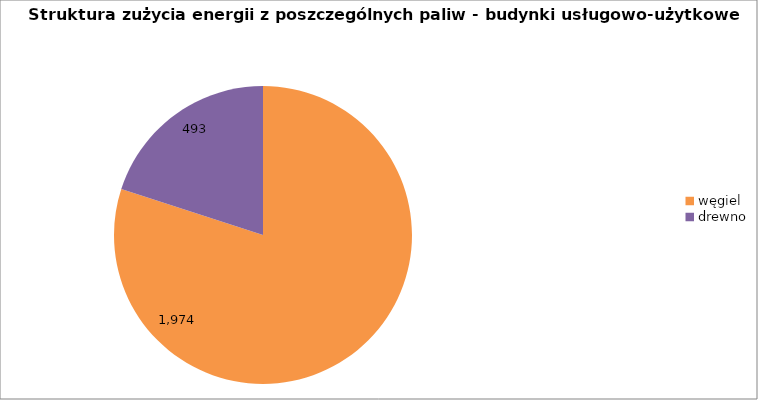
| Category | Series 0 |
|---|---|
| węgiel | 1973.525 |
| drewno | 493.381 |